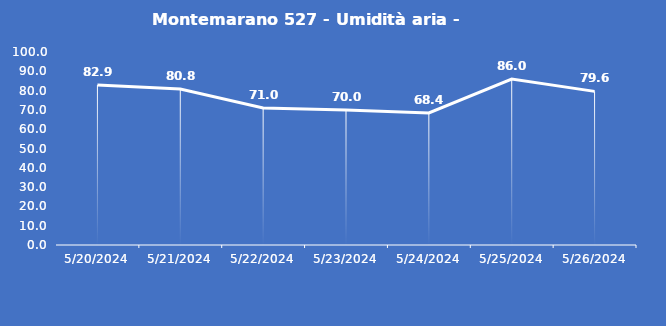
| Category | Montemarano 527 - Umidità aria - Grezzo (%) |
|---|---|
| 5/20/24 | 82.9 |
| 5/21/24 | 80.8 |
| 5/22/24 | 71 |
| 5/23/24 | 70 |
| 5/24/24 | 68.4 |
| 5/25/24 | 86 |
| 5/26/24 | 79.6 |